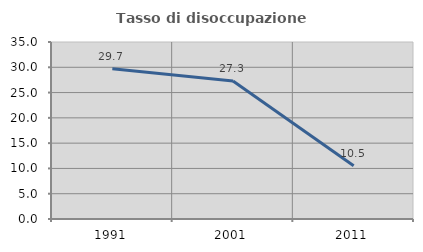
| Category | Tasso di disoccupazione giovanile  |
|---|---|
| 1991.0 | 29.73 |
| 2001.0 | 27.273 |
| 2011.0 | 10.526 |